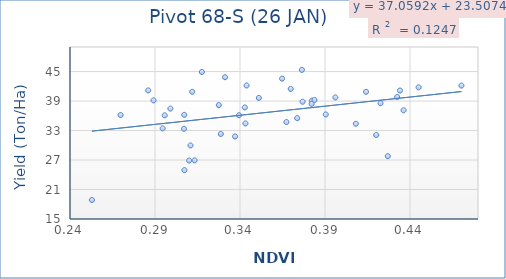
| Category | Series 0 |
|---|---|
| 0.432437 | 39.83 |
| 0.364758 | 43.563 |
| 0.422652 | 38.557 |
| 0.426951 | 27.79 |
| 0.434074 | 41.133 |
| 0.376812 | 38.86 |
| 0.436213 | 37.12 |
| 0.396101 | 39.733 |
| 0.3823 | 39.09 |
| 0.367295 | 34.72 |
| 0.37642 | 45.34 |
| 0.343868 | 42.167 |
| 0.327542 | 38.18 |
| 0.269774 | 36.147 |
| 0.310865 | 29.967 |
| 0.307316 | 24.933 |
| 0.252899 | 18.867 |
| 0.286018 | 41.167 |
| 0.408146 | 34.367 |
| 0.331187 | 43.853 |
| 0.294501 | 33.437 |
| 0.414137 | 40.877 |
| 0.390444 | 36.27 |
| 0.37365 | 35.523 |
| 0.445058 | 41.79 |
| 0.47025 | 42.147 |
| 0.351085 | 39.63 |
| 0.328718 | 32.297 |
| 0.369843 | 41.467 |
| 0.382141 | 38.41 |
| 0.339392 | 36.117 |
| 0.313269 | 26.927 |
| 0.342844 | 37.697 |
| 0.310061 | 26.893 |
| 0.295713 | 36.093 |
| 0.311886 | 40.88 |
| 0.299066 | 37.467 |
| 0.317577 | 44.913 |
| 0.307047 | 33.35 |
| 0.383811 | 39.217 |
| 0.337096 | 31.79 |
| 0.289133 | 39.14 |
| 0.343207 | 34.44 |
| 0.30719 | 36.193 |
| 0.420135 | 32.093 |